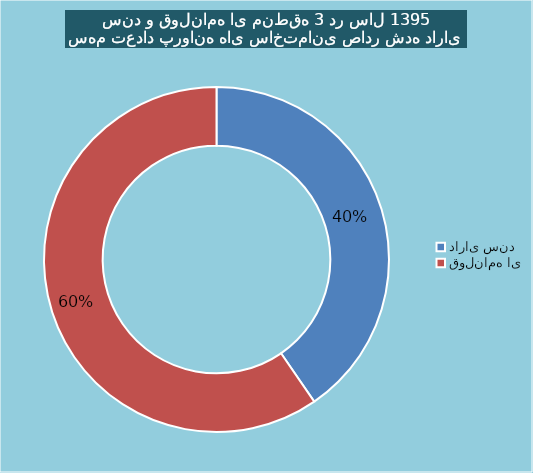
| Category | Series 0 |
|---|---|
| دارای سند | 177 |
| قولنامه ای | 261 |